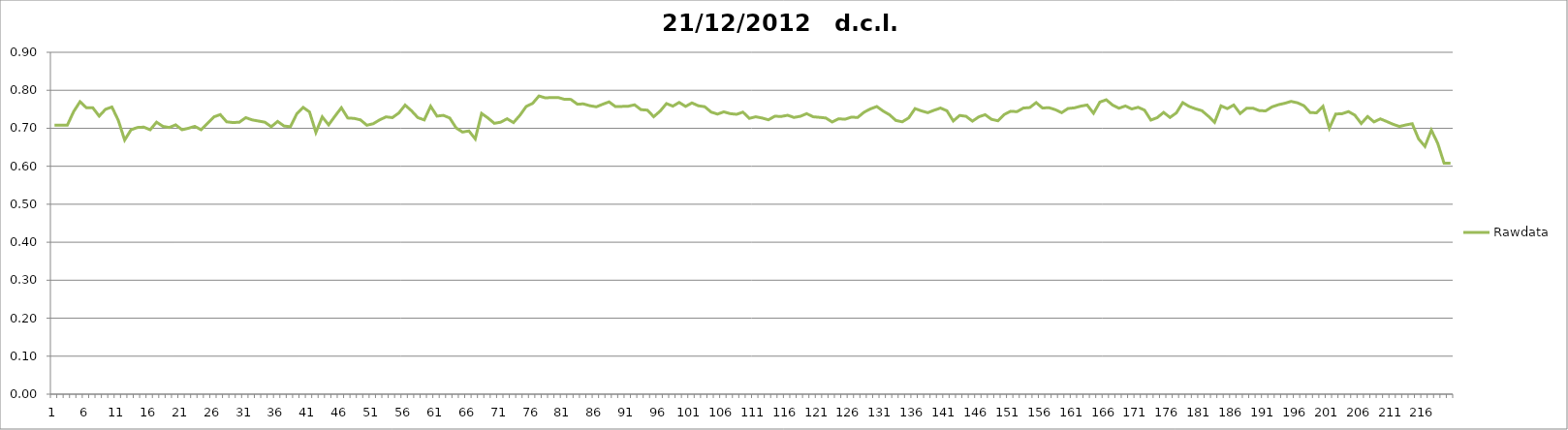
| Category | Rawdata |
|---|---|
| 0 | 0.708 |
| 1 | 0.708 |
| 2 | 0.708 |
| 3 | 0.744 |
| 4 | 0.77 |
| 5 | 0.754 |
| 6 | 0.754 |
| 7 | 0.732 |
| 8 | 0.75 |
| 9 | 0.756 |
| 10 | 0.721 |
| 11 | 0.669 |
| 12 | 0.696 |
| 13 | 0.702 |
| 14 | 0.703 |
| 15 | 0.696 |
| 16 | 0.716 |
| 17 | 0.705 |
| 18 | 0.702 |
| 19 | 0.709 |
| 20 | 0.696 |
| 21 | 0.7 |
| 22 | 0.705 |
| 23 | 0.696 |
| 24 | 0.713 |
| 25 | 0.73 |
| 26 | 0.736 |
| 27 | 0.717 |
| 28 | 0.715 |
| 29 | 0.716 |
| 30 | 0.728 |
| 31 | 0.722 |
| 32 | 0.719 |
| 33 | 0.716 |
| 34 | 0.704 |
| 35 | 0.718 |
| 36 | 0.706 |
| 37 | 0.704 |
| 38 | 0.738 |
| 39 | 0.755 |
| 40 | 0.743 |
| 41 | 0.689 |
| 42 | 0.73 |
| 43 | 0.709 |
| 44 | 0.732 |
| 45 | 0.754 |
| 46 | 0.727 |
| 47 | 0.726 |
| 48 | 0.722 |
| 49 | 0.708 |
| 50 | 0.712 |
| 51 | 0.722 |
| 52 | 0.73 |
| 53 | 0.728 |
| 54 | 0.74 |
| 55 | 0.761 |
| 56 | 0.746 |
| 57 | 0.728 |
| 58 | 0.722 |
| 59 | 0.758 |
| 60 | 0.732 |
| 61 | 0.734 |
| 62 | 0.727 |
| 63 | 0.701 |
| 64 | 0.69 |
| 65 | 0.693 |
| 66 | 0.672 |
| 67 | 0.739 |
| 68 | 0.727 |
| 69 | 0.713 |
| 70 | 0.716 |
| 71 | 0.725 |
| 72 | 0.715 |
| 73 | 0.734 |
| 74 | 0.758 |
| 75 | 0.766 |
| 76 | 0.785 |
| 77 | 0.78 |
| 78 | 0.781 |
| 79 | 0.781 |
| 80 | 0.776 |
| 81 | 0.776 |
| 82 | 0.764 |
| 83 | 0.764 |
| 84 | 0.759 |
| 85 | 0.757 |
| 86 | 0.763 |
| 87 | 0.77 |
| 88 | 0.757 |
| 89 | 0.758 |
| 90 | 0.758 |
| 91 | 0.762 |
| 92 | 0.749 |
| 93 | 0.748 |
| 94 | 0.731 |
| 95 | 0.745 |
| 96 | 0.765 |
| 97 | 0.758 |
| 98 | 0.768 |
| 99 | 0.758 |
| 100 | 0.767 |
| 101 | 0.759 |
| 102 | 0.757 |
| 103 | 0.743 |
| 104 | 0.737 |
| 105 | 0.743 |
| 106 | 0.739 |
| 107 | 0.737 |
| 108 | 0.742 |
| 109 | 0.726 |
| 110 | 0.73 |
| 111 | 0.727 |
| 112 | 0.722 |
| 113 | 0.732 |
| 114 | 0.731 |
| 115 | 0.734 |
| 116 | 0.728 |
| 117 | 0.732 |
| 118 | 0.739 |
| 119 | 0.73 |
| 120 | 0.729 |
| 121 | 0.727 |
| 122 | 0.717 |
| 123 | 0.725 |
| 124 | 0.724 |
| 125 | 0.729 |
| 126 | 0.728 |
| 127 | 0.742 |
| 128 | 0.751 |
| 129 | 0.757 |
| 130 | 0.745 |
| 131 | 0.736 |
| 132 | 0.72 |
| 133 | 0.717 |
| 134 | 0.727 |
| 135 | 0.752 |
| 136 | 0.746 |
| 137 | 0.741 |
| 138 | 0.748 |
| 139 | 0.753 |
| 140 | 0.746 |
| 141 | 0.719 |
| 142 | 0.734 |
| 143 | 0.732 |
| 144 | 0.719 |
| 145 | 0.73 |
| 146 | 0.736 |
| 147 | 0.724 |
| 148 | 0.72 |
| 149 | 0.736 |
| 150 | 0.745 |
| 151 | 0.744 |
| 152 | 0.753 |
| 153 | 0.755 |
| 154 | 0.768 |
| 155 | 0.753 |
| 156 | 0.754 |
| 157 | 0.749 |
| 158 | 0.741 |
| 159 | 0.752 |
| 160 | 0.754 |
| 161 | 0.758 |
| 162 | 0.761 |
| 163 | 0.74 |
| 164 | 0.769 |
| 165 | 0.775 |
| 166 | 0.761 |
| 167 | 0.753 |
| 168 | 0.759 |
| 169 | 0.751 |
| 170 | 0.755 |
| 171 | 0.748 |
| 172 | 0.722 |
| 173 | 0.728 |
| 174 | 0.742 |
| 175 | 0.729 |
| 176 | 0.741 |
| 177 | 0.768 |
| 178 | 0.758 |
| 179 | 0.751 |
| 180 | 0.746 |
| 181 | 0.732 |
| 182 | 0.716 |
| 183 | 0.759 |
| 184 | 0.752 |
| 185 | 0.761 |
| 186 | 0.739 |
| 187 | 0.753 |
| 188 | 0.753 |
| 189 | 0.747 |
| 190 | 0.746 |
| 191 | 0.756 |
| 192 | 0.762 |
| 193 | 0.766 |
| 194 | 0.771 |
| 195 | 0.767 |
| 196 | 0.76 |
| 197 | 0.741 |
| 198 | 0.741 |
| 199 | 0.758 |
| 200 | 0.7 |
| 201 | 0.738 |
| 202 | 0.738 |
| 203 | 0.744 |
| 204 | 0.735 |
| 205 | 0.713 |
| 206 | 0.731 |
| 207 | 0.717 |
| 208 | 0.725 |
| 209 | 0.718 |
| 210 | 0.711 |
| 211 | 0.705 |
| 212 | 0.709 |
| 213 | 0.712 |
| 214 | 0.672 |
| 215 | 0.652 |
| 216 | 0.695 |
| 217 | 0.661 |
| 218 | 0.608 |
| 219 | 0.608 |